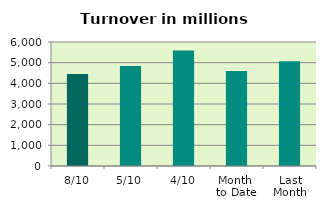
| Category | Series 0 |
|---|---|
| 8/10 | 4456.591 |
| 5/10 | 4843.363 |
| 4/10 | 5583.851 |
| Month 
to Date | 4591.234 |
| Last
Month | 5068.328 |